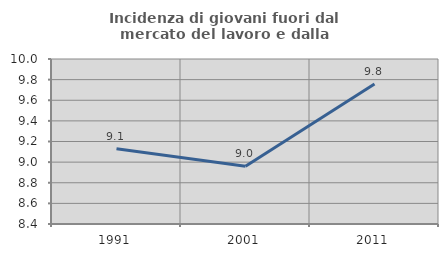
| Category | Incidenza di giovani fuori dal mercato del lavoro e dalla formazione  |
|---|---|
| 1991.0 | 9.13 |
| 2001.0 | 8.96 |
| 2011.0 | 9.759 |